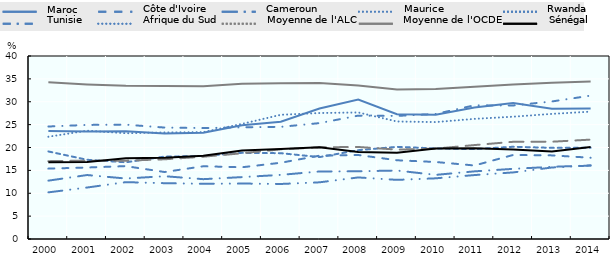
| Category | Maroc | Côte d'Ivoire | Cameroun | Maurice | Rwanda | Tunisie | Afrique du Sud | Moyenne de l'ALC | Moyenne de l'OCDE | Sénégal |
|---|---|---|---|---|---|---|---|---|---|---|
| 2000.0 | 23.629 | 15.384 | 12.755 | 19.138 | 10.194 | 24.587 | 22.357 | 17.016 | 34.245 | 16.787 |
| 2001.0 | 23.476 | 15.627 | 13.981 | 17.318 | 11.251 | 24.937 | 23.67 | 17.125 | 33.789 | 16.819 |
| 2002.0 | 23.546 | 15.929 | 13.221 | 16.766 | 12.428 | 24.994 | 23.12 | 17.118 | 33.5 | 17.65 |
| 2003.0 | 23.056 | 14.64 | 13.724 | 18.017 | 12.203 | 24.359 | 23.286 | 17.422 | 33.457 | 17.733 |
| 2004.0 | 23.206 | 15.901 | 13.078 | 18.137 | 12.066 | 24.249 | 23.359 | 17.988 | 33.4 | 18.185 |
| 2005.0 | 24.842 | 15.678 | 13.53 | 18.834 | 12.125 | 24.411 | 25.161 | 18.743 | 33.936 | 19.319 |
| 2006.0 | 25.635 | 16.669 | 14.016 | 18.757 | 12.028 | 24.515 | 27.149 | 19.6 | 34.059 | 19.665 |
| 2007.0 | 28.533 | 18.219 | 14.758 | 17.902 | 12.389 | 25.328 | 27.536 | 20.045 | 34.103 | 20.074 |
| 2008.0 | 30.461 | 18.363 | 14.805 | 19.413 | 13.458 | 26.965 | 27.659 | 20.116 | 33.561 | 19.003 |
| 2009.0 | 27.258 | 17.21 | 14.964 | 20.14 | 12.925 | 26.904 | 25.687 | 19.54 | 32.676 | 18.87 |
| 2010.0 | 27.145 | 16.832 | 14.018 | 19.807 | 13.263 | 27.333 | 25.557 | 19.755 | 32.784 | 19.804 |
| 2011.0 | 28.743 | 16.069 | 14.784 | 19.649 | 13.974 | 29.218 | 26.26 | 20.53 | 33.294 | 19.851 |
| 2012.0 | 29.722 | 18.37 | 15.333 | 20.16 | 14.554 | 29.186 | 26.733 | 21.244 | 33.79 | 19.539 |
| 2013.0 | 28.459 | 18.277 | 15.776 | 19.926 | 15.628 | 30.06 | 27.348 | 21.264 | 34.155 | 19.152 |
| 2014.0 | 28.501 | 17.763 | 16.076 | 19.962 | 16.061 | 31.335 | 27.838 | 21.723 | 34.444 | 20.133 |